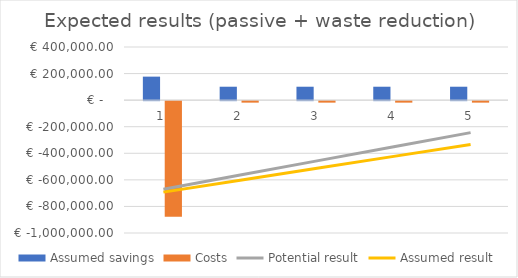
| Category | Assumed savings | Costs |
|---|---|---|
| 0 | 176956.326 | -869277.2 |
| 1 | 101012.279 | -11286.4 |
| 2 | 101012.279 | -11286.4 |
| 3 | 101012.279 | -11286.4 |
| 4 | 101012.279 | -11286.4 |